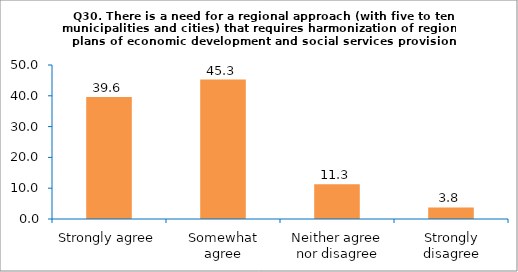
| Category | Series 0 |
|---|---|
| Strongly agree | 39.623 |
| Somewhat agree | 45.283 |
| Neither agree nor disagree | 11.321 |
| Strongly disagree | 3.774 |